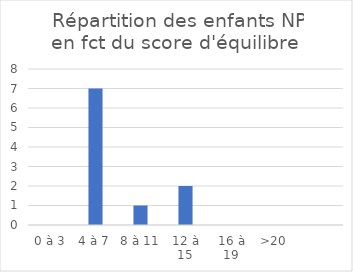
| Category | Series 0 |
|---|---|
| 0 à 3 | 0 |
| 4 à 7 | 7 |
| 8 à 11 | 1 |
| 12 à 15 | 2 |
| 16 à 19 | 0 |
| >20 | 0 |